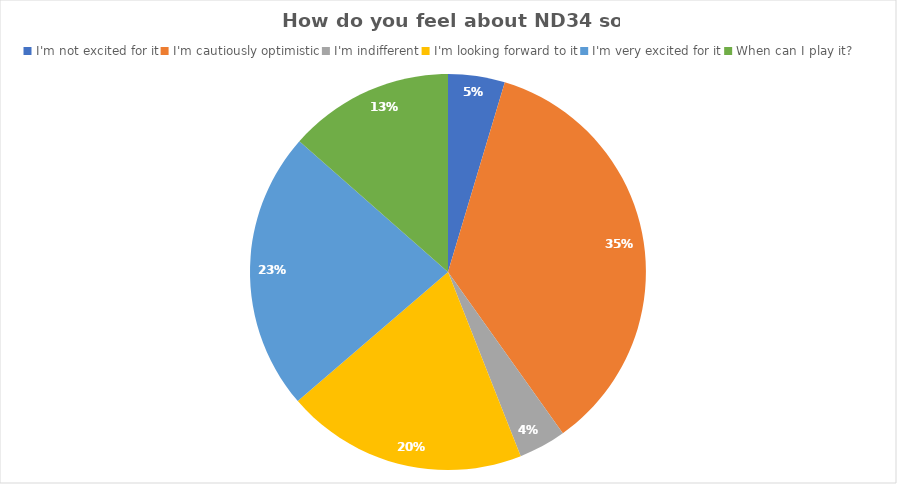
| Category | Series 0 |
|---|---|
| I'm not excited for it | 12 |
| I'm cautiously optimistic | 92 |
| I'm indifferent | 10 |
| I'm looking forward to it | 51 |
| I'm very excited for it | 59 |
| When can I play it? | 35 |